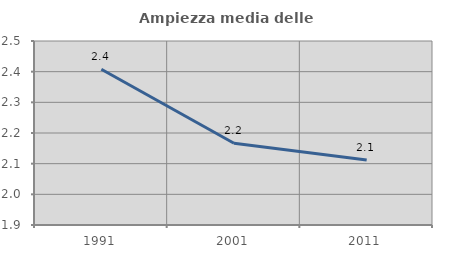
| Category | Ampiezza media delle famiglie |
|---|---|
| 1991.0 | 2.408 |
| 2001.0 | 2.167 |
| 2011.0 | 2.112 |